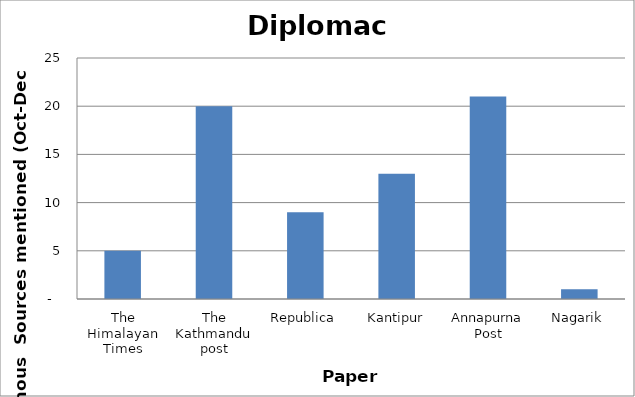
| Category | Diplomacy |
|---|---|
| The Himalayan Times | 5 |
| The Kathmandu post | 20 |
| Republica | 9 |
| Kantipur | 13 |
| Annapurna Post | 21 |
| Nagarik | 1 |